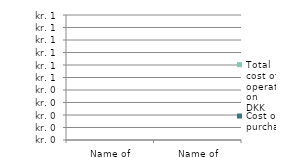
| Category | Cost of purchase DKK | Total cost of operation DKK |
|---|---|---|
| Name of PRODUCT 1 | 0 | 0 |
| Name of PRODUCT 2 | 0 | 0 |